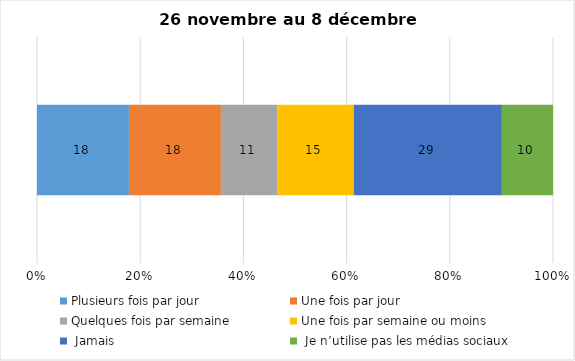
| Category | Plusieurs fois par jour | Une fois par jour | Quelques fois par semaine   | Une fois par semaine ou moins   |  Jamais   |  Je n’utilise pas les médias sociaux |
|---|---|---|---|---|---|---|
| 0 | 18 | 18 | 11 | 15 | 29 | 10 |